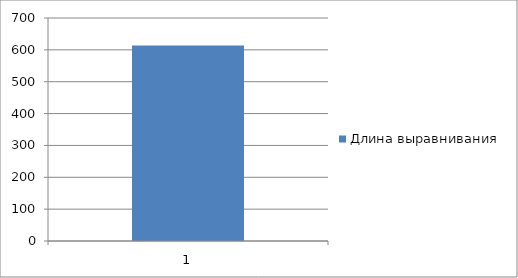
| Category | Длина выравнивания |
|---|---|
| 0 | 1 |